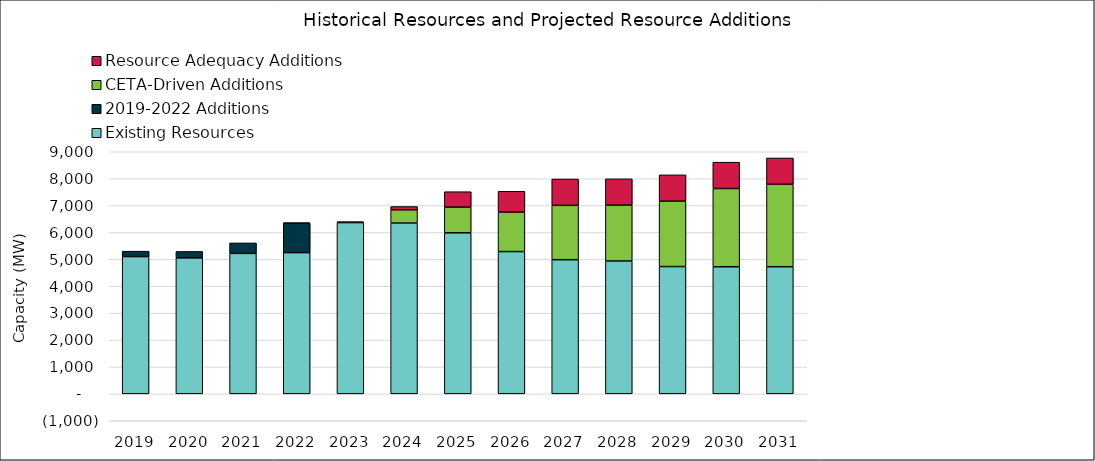
| Category | Existing Resources | 2019-2022 Additions | CETA-Driven Additions | Resource Adequacy Additions |
|---|---|---|---|---|
| 2019.0 | 5104.194 | 200 | 0 | 0 |
| 2020.0 | 5054.388 | 240 | 0 | 0 |
| 2021.0 | 5221.049 | 390.4 | 0 | 0 |
| 2022.0 | 5250.343 | 1095.2 | 7 | 0 |
| 2023.0 | 6367 | 0 | 35 | 0 |
| 2024.0 | 6349.9 | 0 | 492 | 122 |
| 2025.0 | 5985.8 | 0 | 955 | 574 |
| 2026.0 | 5289.49 | 0 | 1465 | 776 |
| 2027.0 | 4987.3 | 0 | 2020 | 979 |
| 2028.0 | 4938.3 | 0 | 2075 | 979 |
| 2029.0 | 4732.3 | 0 | 2430 | 979 |
| 2030.0 | 4725.3 | 0 | 2908 | 979 |
| 2031.0 | 4726.3 | 0 | 3064 | 979 |